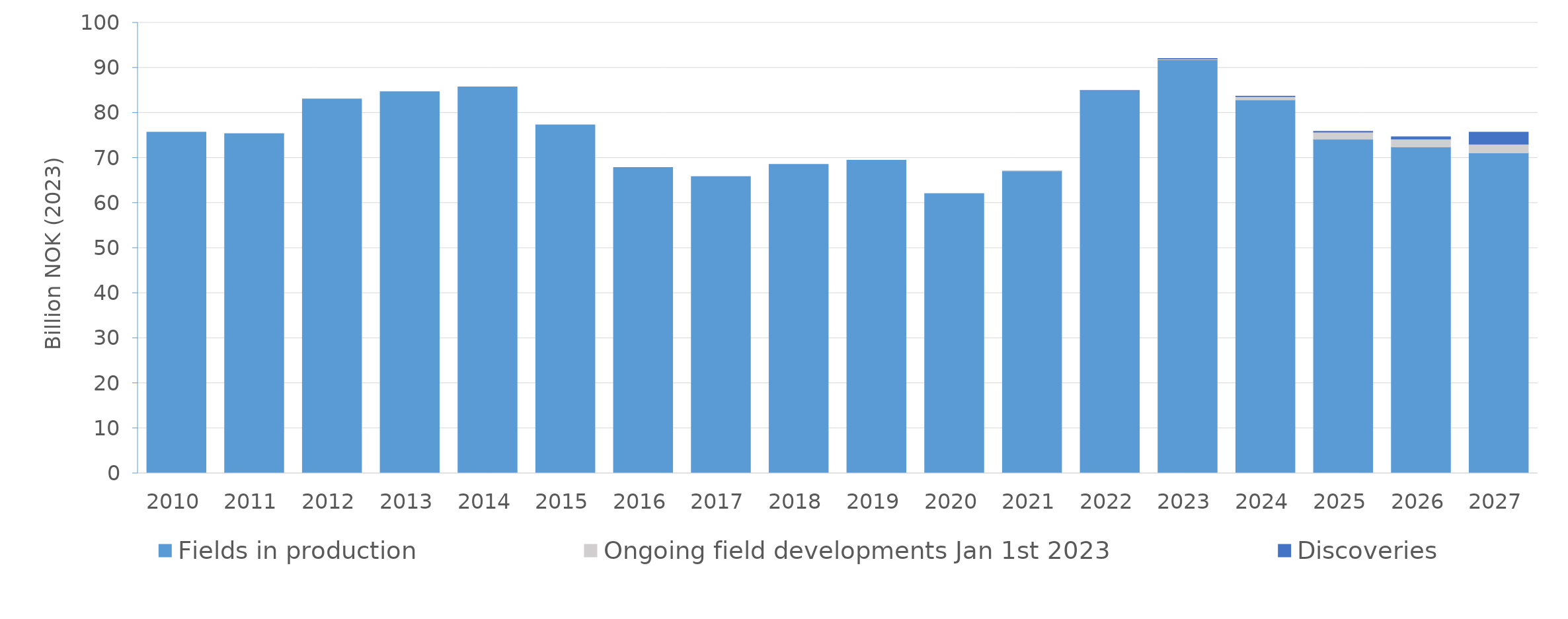
| Category | Fields in production | Ongoing field developments Jan 1st 2023 | Discoveries |
|---|---|---|---|
| 2010.0 | 75.729 | 0 | 0 |
| 2011.0 | 75.4 | 0 | 0 |
| 2012.0 | 83.104 | 0 | 0 |
| 2013.0 | 84.722 | 0 | 0 |
| 2014.0 | 85.776 | 0 | 0 |
| 2015.0 | 77.354 | 0 | 0 |
| 2016.0 | 67.899 | 0 | 0 |
| 2017.0 | 65.857 | 0 | 0 |
| 2018.0 | 68.596 | 0 | 0 |
| 2019.0 | 69.501 | 0 | 0 |
| 2020.0 | 62.09 | 0 | 0 |
| 2021.0 | 67.104 | 0.002 | 0 |
| 2022.0 | 84.9 | 0.02 | 0.046 |
| 2023.0 | 91.791 | 0.197 | 0.077 |
| 2024.0 | 82.881 | 0.74 | 0.099 |
| 2025.0 | 74.172 | 1.572 | 0.154 |
| 2026.0 | 72.448 | 1.729 | 0.512 |
| 2027.0 | 71.124 | 1.942 | 2.67 |